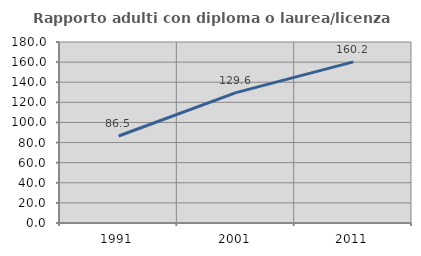
| Category | Rapporto adulti con diploma o laurea/licenza media  |
|---|---|
| 1991.0 | 86.521 |
| 2001.0 | 129.627 |
| 2011.0 | 160.187 |